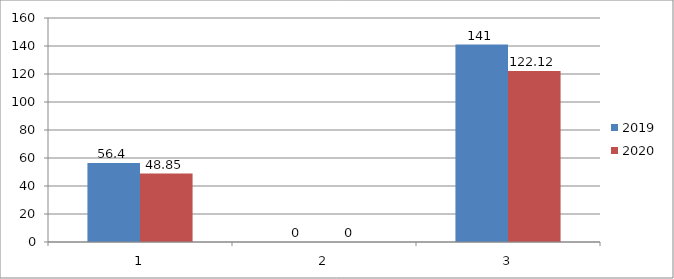
| Category | 2019 | 2020 |
|---|---|---|
| 0 | 56.4 | 48.85 |
| 1 | 0 | 0 |
| 2 | 141 | 122.12 |